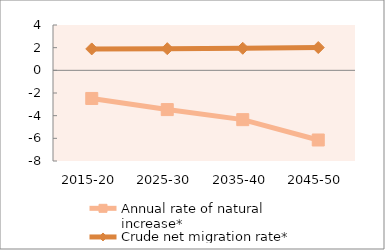
| Category | Annual rate of natural increase* | Crude net migration rate* |
|---|---|---|
| 2015-20 | -2.482 | 1.888 |
| 2025-30 | -3.463 | 1.91 |
| 2035-40 | -4.351 | 1.946 |
| 2045-50 | -6.146 | 2.011 |